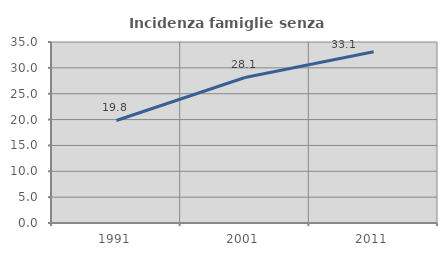
| Category | Incidenza famiglie senza nuclei |
|---|---|
| 1991.0 | 19.825 |
| 2001.0 | 28.141 |
| 2011.0 | 33.123 |